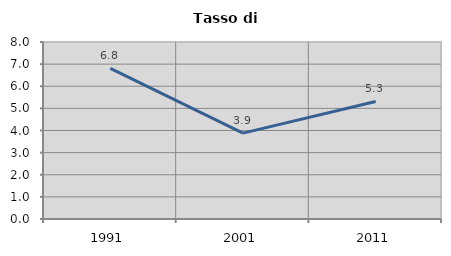
| Category | Tasso di disoccupazione   |
|---|---|
| 1991.0 | 6.808 |
| 2001.0 | 3.881 |
| 2011.0 | 5.311 |